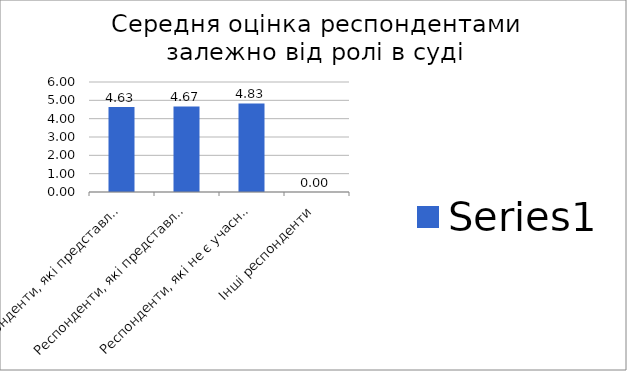
| Category | Series 0 |
|---|---|
| Респонденти, які представляють особисто себе | 4.63 |
| Респонденти, які представляють іншу особу | 4.667 |
| Респонденти, які не є учасниками судових проваджень | 4.833 |
| Інші респонденти | 0 |